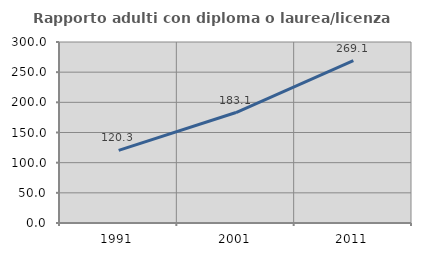
| Category | Rapporto adulti con diploma o laurea/licenza media  |
|---|---|
| 1991.0 | 120.349 |
| 2001.0 | 183.077 |
| 2011.0 | 269.101 |